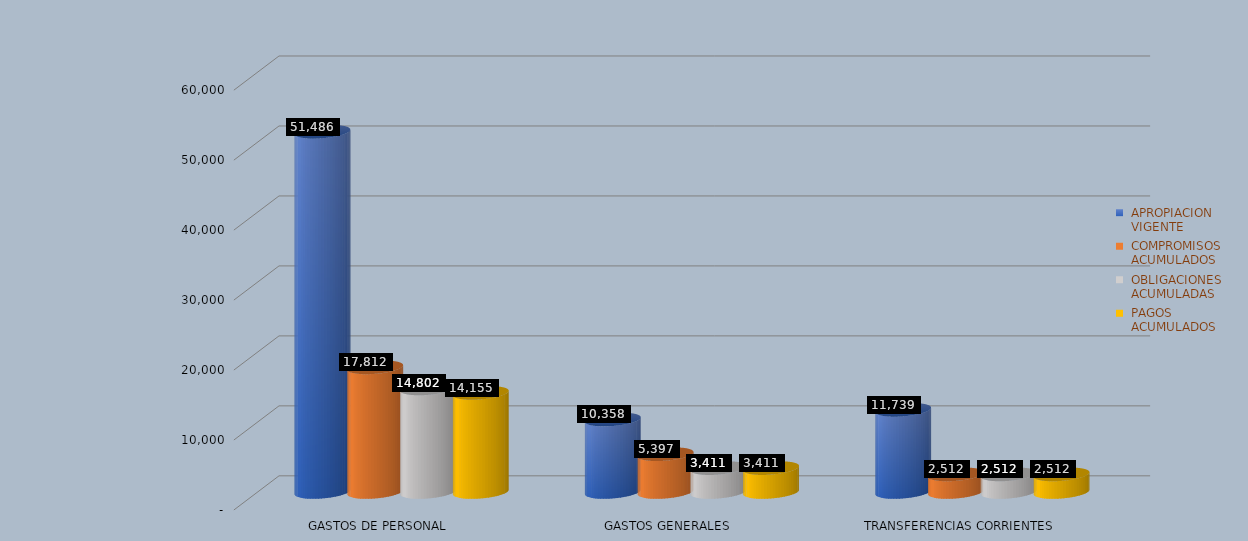
| Category |  APROPIACION
 VIGENTE |  COMPROMISOS
 ACUMULADOS |  OBLIGACIONES
 ACUMULADAS |  PAGOS
 ACUMULADOS |
|---|---|---|---|---|
| GASTOS DE PERSONAL | 51485.706 | 17812.129 | 14801.825 | 14155.444 |
| GASTOS GENERALES | 10357.915 | 5396.569 | 3411.105 | 3411.105 |
| TRANSFERENCIAS CORRIENTES | 11739.403 | 2512.109 | 2512.109 | 2512.109 |